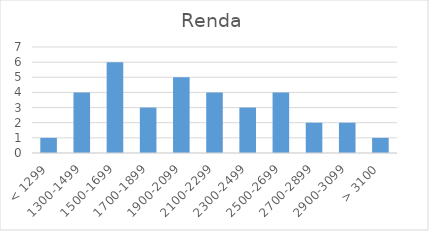
| Category | Renda |
|---|---|
| < 1299 | 1 |
| 1300-1499 | 4 |
| 1500-1699 | 6 |
| 1700-1899 | 3 |
| 1900-2099 | 5 |
| 2100-2299 | 4 |
| 2300-2499 | 3 |
| 2500-2699 | 4 |
| 2700-2899 | 2 |
| 2900-3099 | 2 |
| > 3100 | 1 |